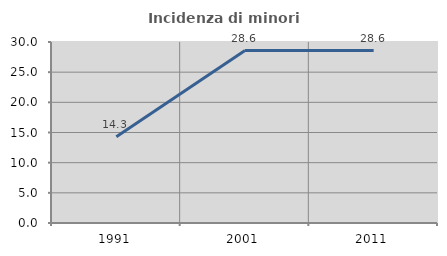
| Category | Incidenza di minori stranieri |
|---|---|
| 1991.0 | 14.286 |
| 2001.0 | 28.571 |
| 2011.0 | 28.571 |